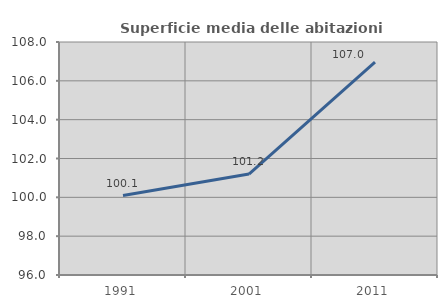
| Category | Superficie media delle abitazioni occupate |
|---|---|
| 1991.0 | 100.092 |
| 2001.0 | 101.197 |
| 2011.0 | 106.966 |